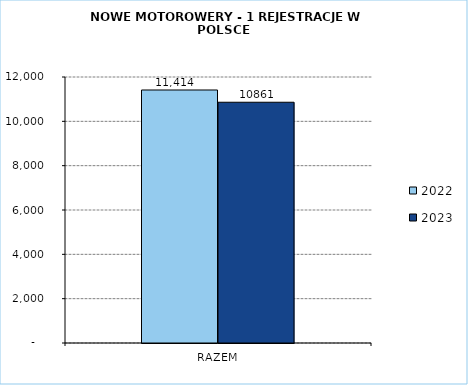
| Category | 2022 | 2023 |
|---|---|---|
| RAZEM | 11414 | 10861 |